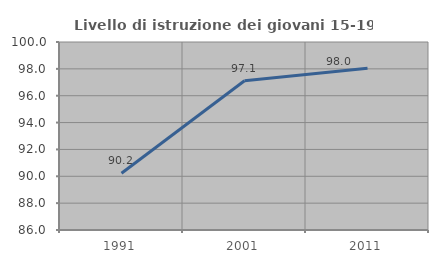
| Category | Livello di istruzione dei giovani 15-19 anni |
|---|---|
| 1991.0 | 90.23 |
| 2001.0 | 97.11 |
| 2011.0 | 98.039 |